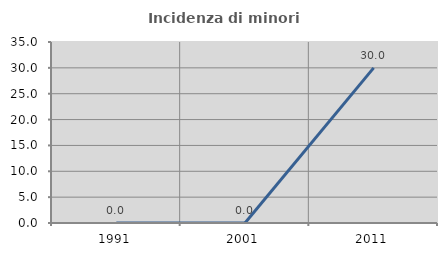
| Category | Incidenza di minori stranieri |
|---|---|
| 1991.0 | 0 |
| 2001.0 | 0 |
| 2011.0 | 30 |